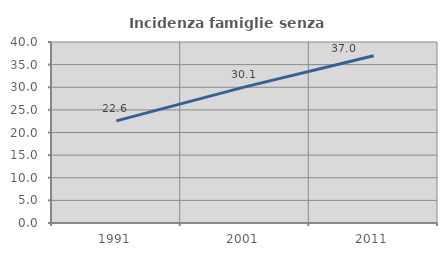
| Category | Incidenza famiglie senza nuclei |
|---|---|
| 1991.0 | 22.561 |
| 2001.0 | 30.089 |
| 2011.0 | 36.978 |